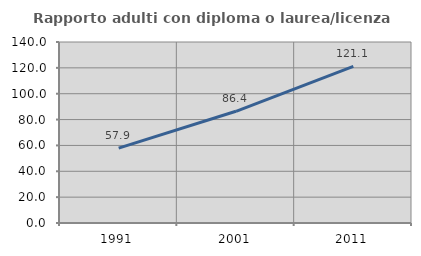
| Category | Rapporto adulti con diploma o laurea/licenza media  |
|---|---|
| 1991.0 | 57.895 |
| 2001.0 | 86.414 |
| 2011.0 | 121.15 |